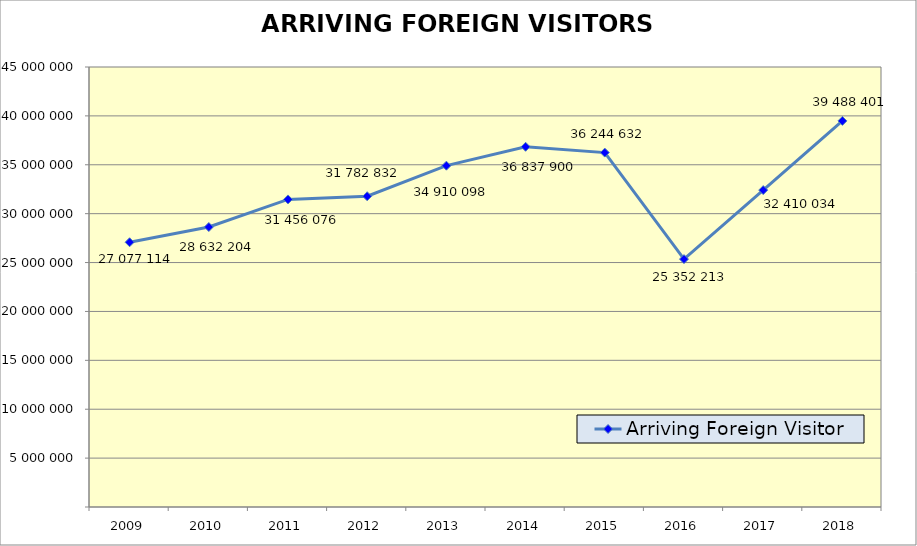
| Category | Arriving Foreign Visitor |
|---|---|
| 2009 | 27077114 |
| 2010 | 28632204 |
| 2011 | 31456076 |
| 2012 | 31782832 |
| 2013 | 34910098 |
| 2014 | 36837900 |
| 2015 | 36244632 |
| 2016 | 25352213 |
| 2017 | 32410034 |
| 2018 | 39488401 |